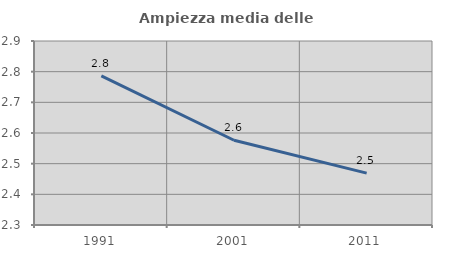
| Category | Ampiezza media delle famiglie |
|---|---|
| 1991.0 | 2.786 |
| 2001.0 | 2.576 |
| 2011.0 | 2.469 |